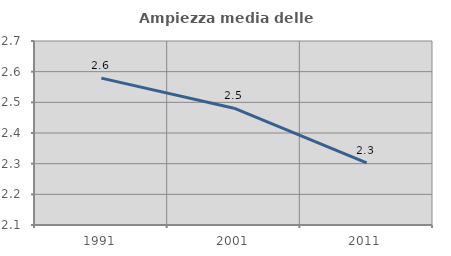
| Category | Ampiezza media delle famiglie |
|---|---|
| 1991.0 | 2.579 |
| 2001.0 | 2.481 |
| 2011.0 | 2.303 |